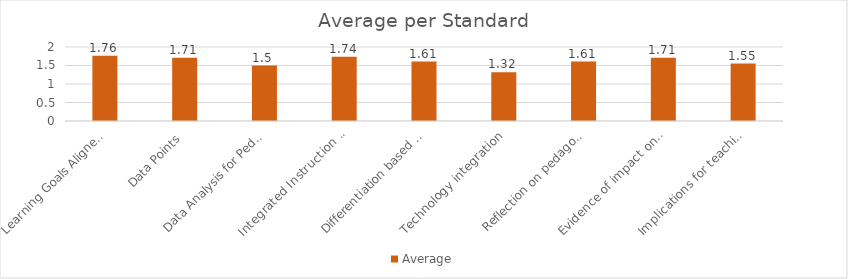
| Category | Average |
|---|---|
| Learning Goals Aligned with Pre-/Post-assessments ACEI 4.0 | 1.763 |
| Data Points | 1.711 |
| Data Analysis for Pedagogical Decisions ACEI 4.0 | 1.5 |
| Integrated Instruction ACEI 3.1 | 1.737 |
| Differentiation based on knowledge of individual learning ACEI 3.2 | 1.605 |
| Technology integration | 1.316 |
| Reflection on pedagogical decisions ACEI 1.0 | 1.605 |
| Evidence of impact on student learning ACEI 5.1 | 1.711 |
| Implications for teaching and professional development ACEI 5.1 | 1.553 |